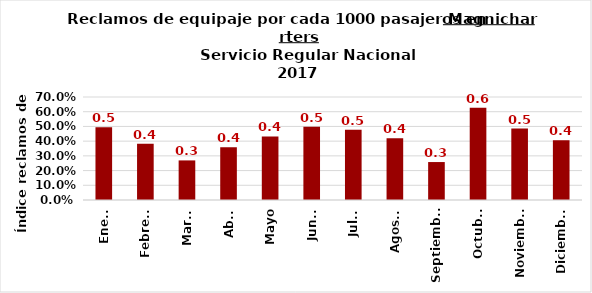
| Category | Reclamos por cada 1000 pasajeros |
|---|---|
| Enero | 0.495 |
| Febrero | 0.383 |
| Marzo | 0.269 |
| Abril | 0.359 |
| Mayo | 0.432 |
| Junio | 0.499 |
| Julio | 0.478 |
| Agosto | 0.419 |
| Septiembre | 0.258 |
| Octubre | 0.628 |
| Noviembre | 0.485 |
| Diciembre | 0.406 |